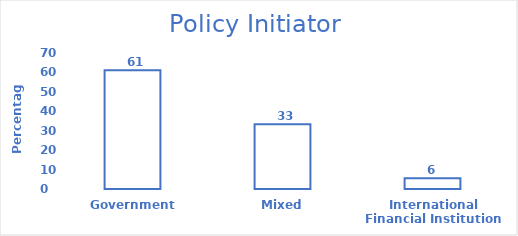
| Category | Series 0 |
|---|---|
| Government | 61.111 |
| Mixed | 33.333 |
| International Financial Institution | 5.556 |